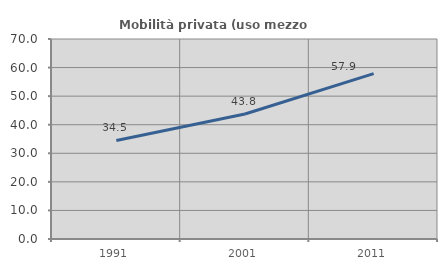
| Category | Mobilità privata (uso mezzo privato) |
|---|---|
| 1991.0 | 34.494 |
| 2001.0 | 43.766 |
| 2011.0 | 57.86 |